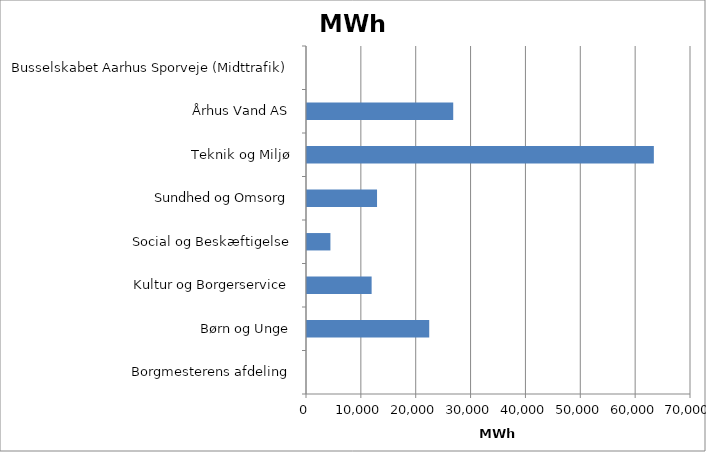
| Category | Elforbrug MWh |
|---|---|
| Borgmesterens afdeling | 0 |
| Børn og Unge | 22281.359 |
| Kultur og Borgerservice | 11780.844 |
| Social og Beskæftigelse | 4267.894 |
| Sundhed og Omsorg | 12767 |
| Teknik og Miljø | 63228.599 |
| Århus Vand AS | 26655.874 |
| Busselskabet Aarhus Sporveje (Midttrafik) | 0 |